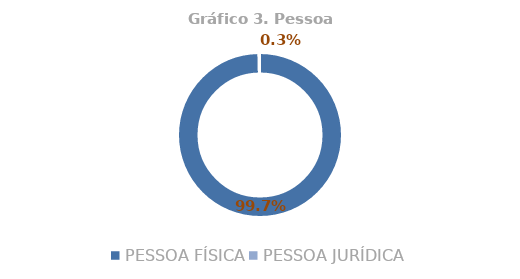
| Category | Total |
|---|---|
| PESSOA FÍSICA | 0.997 |
| PESSOA JURÍDICA | 0.003 |